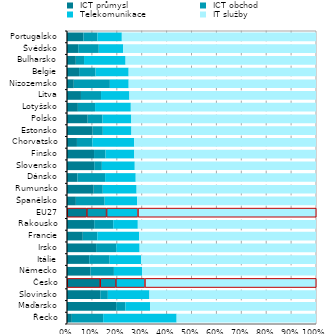
| Category |  ICT průmysl |  ICT obchod |  Telekomunikace |  IT služby |
|---|---|---|---|---|
| Řecko | 0.019 | 0.126 | 0.295 | 0.56 |
| Maďarsko | 0.198 | 0.037 | 0.099 | 0.667 |
| Slovinsko | 0.134 | 0.03 | 0.167 | 0.669 |
| Česko | 0.133 | 0.063 | 0.117 | 0.688 |
| Německo | 0.095 | 0.094 | 0.113 | 0.699 |
| Itálie | 0.089 | 0.082 | 0.126 | 0.703 |
| Irsko | 0.117 | 0.081 | 0.094 | 0.708 |
| Francie | 0.063 | 0.058 | 0.168 | 0.71 |
| Rakousko | 0.109 | 0.076 | 0.099 | 0.716 |
| EU27 | 0.079 | 0.079 | 0.126 | 0.716 |
| Španělsko | 0.036 | 0.115 | 0.131 | 0.718 |
| Rumunsko | 0.107 | 0.037 | 0.136 | 0.72 |
| Dánsko | 0.042 | 0.111 | 0.123 | 0.724 |
| Slovensko | 0.109 | 0.031 | 0.132 | 0.728 |
| Finsko | 0.109 | 0.046 | 0.116 | 0.73 |
| Chorvatsko | 0.04 | 0.062 | 0.168 | 0.73 |
| Estonsko | 0.103 | 0.041 | 0.115 | 0.741 |
| Polsko | 0.083 | 0.06 | 0.116 | 0.742 |
| Lotyšsko | 0.044 | 0.069 | 0.144 | 0.744 |
| Litva | 0.056 | 0.081 | 0.114 | 0.749 |
| Nizozemsko | 0.027 | 0.145 | 0.076 | 0.752 |
| Belgie | 0.049 | 0.066 | 0.133 | 0.752 |
| Bulharsko | 0.035 | 0.033 | 0.167 | 0.765 |
| Švédsko | 0.045 | 0.083 | 0.098 | 0.774 |
| Portugalsko | 0.066 | 0.057 | 0.098 | 0.78 |